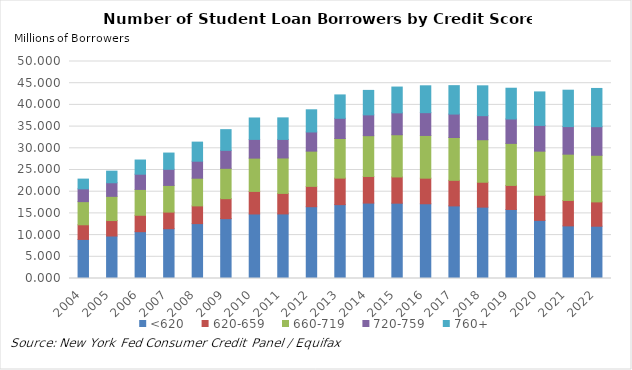
| Category | <620 | 620-659 | 660-719 | 720-759 | 760+ |
|---|---|---|---|---|---|
| 2004.0 | 9.004 | 3.374 | 5.334 | 2.946 | 2.244 |
| 2005.0 | 9.787 | 3.567 | 5.574 | 3.132 | 2.673 |
| 2006.0 | 10.787 | 3.782 | 5.955 | 3.51 | 3.264 |
| 2007.0 | 11.475 | 3.824 | 6.148 | 3.714 | 3.743 |
| 2008.0 | 12.649 | 4.08 | 6.379 | 3.916 | 4.4 |
| 2009.0 | 13.794 | 4.599 | 6.99 | 4.146 | 4.767 |
| 2010.0 | 14.866 | 5.201 | 7.67 | 4.312 | 4.936 |
| 2011.0 | 14.881 | 4.725 | 8.165 | 4.273 | 4.966 |
| 2012.0 | 16.542 | 4.685 | 8.119 | 4.416 | 5.109 |
| 2013.0 | 17.019 | 6.11 | 9.126 | 4.657 | 5.388 |
| 2014.0 | 17.378 | 6.132 | 9.4 | 4.792 | 5.64 |
| 2015.0 | 17.354 | 6.042 | 9.729 | 5.045 | 5.942 |
| 2016.0 | 17.219 | 5.896 | 9.843 | 5.251 | 6.191 |
| 2017.0 | 16.726 | 5.895 | 9.867 | 5.398 | 6.549 |
| 2018.0 | 16.444 | 5.735 | 9.794 | 5.546 | 6.877 |
| 2019.0 | 15.906 | 5.542 | 9.68 | 5.627 | 7.087 |
| 2020.0 | 13.387 | 5.792 | 10.165 | 5.934 | 7.713 |
| 2021.0 | 12.123 | 5.861 | 10.667 | 6.351 | 8.386 |
| 2022.0 | 12.048 | 5.602 | 10.745 | 6.582 | 8.812 |